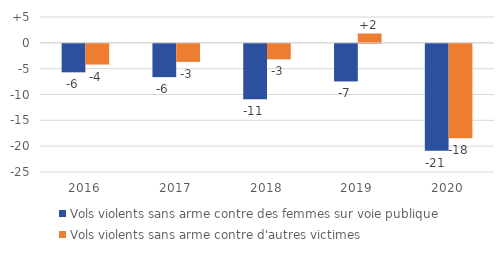
| Category | Vols violents sans arme contre des femmes sur voie publique | Vols violents sans arme contre d'autres victimes |
|---|---|---|
| 2016.0 | -5.514 | -4.007 |
| 2017.0 | -6.449 | -3.495 |
| 2018.0 | -10.706 | -3.007 |
| 2019.0 | -7.277 | 1.807 |
| 2020.0 | -20.676 | -18.289 |